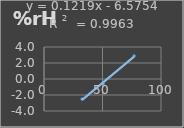
| Category | Humedad |
|---|---|
| 32.5 | -2.5 |
| 50.6 | -0.6 |
| 77.1 | 2.9 |